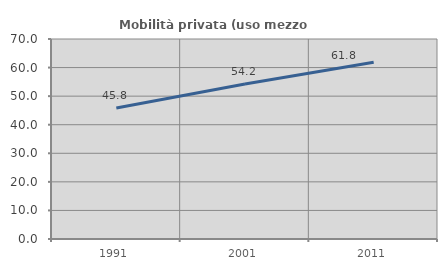
| Category | Mobilità privata (uso mezzo privato) |
|---|---|
| 1991.0 | 45.833 |
| 2001.0 | 54.237 |
| 2011.0 | 61.832 |